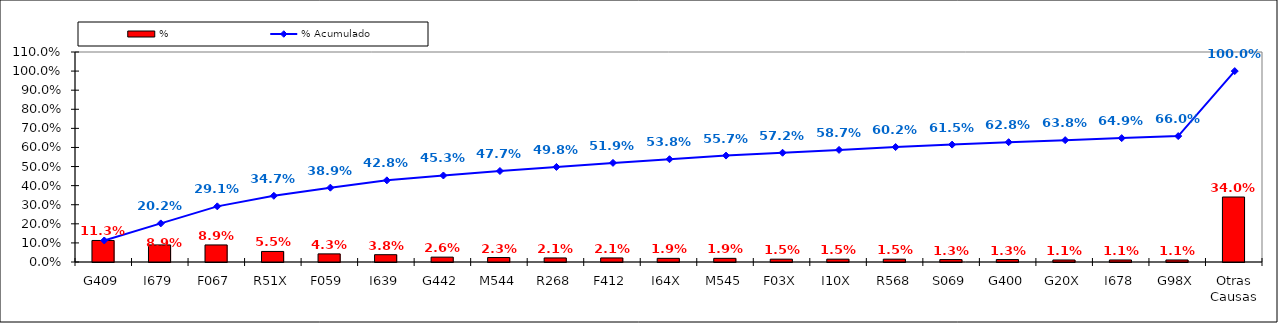
| Category | % |
|---|---|
| G409 | 0.113 |
| I679 | 0.089 |
| F067 | 0.089 |
| R51X | 0.055 |
| F059 | 0.043 |
| I639 | 0.038 |
| G442 | 0.026 |
| M544 | 0.023 |
| R268 | 0.021 |
| F412 | 0.021 |
| I64X | 0.019 |
| M545 | 0.019 |
| F03X | 0.015 |
| I10X | 0.015 |
| R568 | 0.015 |
| S069 | 0.013 |
| G400 | 0.013 |
| G20X | 0.011 |
| I678 | 0.011 |
| G98X | 0.011 |
| Otras Causas | 0.34 |